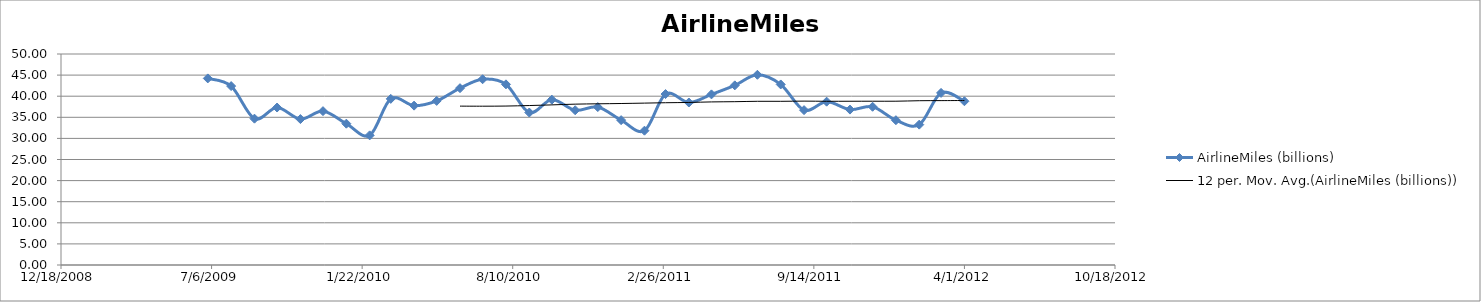
| Category | AirlineMiles (billions) |
|---|---|
| 39995.0 | 44.216 |
| 40026.0 | 42.397 |
| 40057.0 | 34.675 |
| 40087.0 | 37.318 |
| 40118.0 | 34.577 |
| 40148.0 | 36.459 |
| 40179.0 | 33.487 |
| 40210.0 | 30.718 |
| 40238.0 | 39.37 |
| 40269.0 | 37.762 |
| 40299.0 | 38.884 |
| 40330.0 | 41.902 |
| 40360.0 | 44.022 |
| 40391.0 | 42.813 |
| 40422.0 | 36.132 |
| 40452.0 | 39.183 |
| 40483.0 | 36.672 |
| 40513.0 | 37.426 |
| 40544.0 | 34.327 |
| 40575.0 | 31.825 |
| 40603.0 | 40.507 |
| 40634.0 | 38.506 |
| 40664.0 | 40.43 |
| 40695.0 | 42.57 |
| 40725.0 | 45.074 |
| 40756.0 | 42.782 |
| 40787.0 | 36.699 |
| 40817.0 | 38.704 |
| 40848.0 | 36.828 |
| 40878.0 | 37.493 |
| 40909.0 | 34.314 |
| 40940.0 | 33.264 |
| 40969.0 | 40.781 |
| 41000.0 | 38.807 |